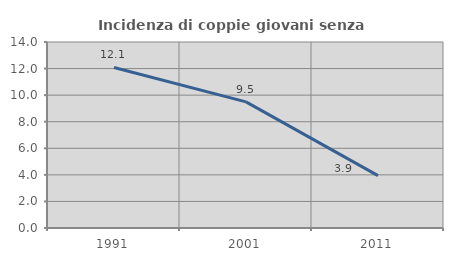
| Category | Incidenza di coppie giovani senza figli |
|---|---|
| 1991.0 | 12.085 |
| 2001.0 | 9.491 |
| 2011.0 | 3.944 |